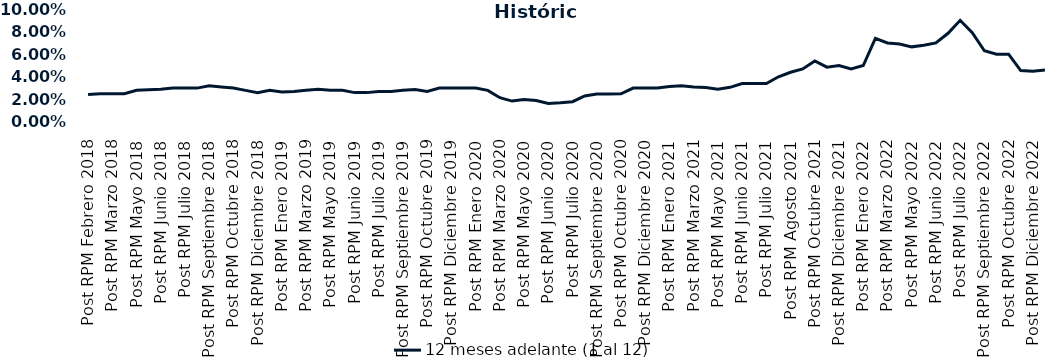
| Category | 12 meses adelante (1 al 12)  |
|---|---|
| Post RPM Febrero 2018 | 0.024 |
| Pre RPM Marzo 2018 | 0.025 |
| Post RPM Marzo 2018 | 0.025 |
| Pre RPM Mayo 2018 | 0.025 |
| Post RPM Mayo 2018 | 0.028 |
| Pre RPM Junio 2018 | 0.028 |
| Post RPM Junio 2018 | 0.029 |
| Pre RPM Julio 2018 | 0.03 |
| Post RPM Julio 2018 | 0.03 |
| Pre RPM Septiembre 2018 | 0.03 |
| Post RPM Septiembre 2018 | 0.032 |
| Pre RPM Octubre 2018 | 0.031 |
| Post RPM Octubre 2018 | 0.03 |
| Pre RPM Diciembre 2018 | 0.028 |
| Post RPM Diciembre 2018 | 0.026 |
| Pre RPM Enero 2019 | 0.028 |
| Post RPM Enero 2019 | 0.026 |
| Pre RPM Marzo 2019 | 0.027 |
| Post RPM Marzo 2019 | 0.028 |
| Pre RPM Mayo 2019 | 0.029 |
| Post RPM Mayo 2019 | 0.028 |
| Pre RPM Junio 2019 | 0.028 |
| Post RPM Junio 2019 | 0.026 |
| Pre RPM Julio 2019 | 0.026 |
| Post RPM Julio 2019 | 0.027 |
| Pre RPM Septiembre 2019 | 0.027 |
| Post RPM Septiembre 2019 | 0.028 |
| Pre RPM Octubre 2019 | 0.029 |
| Post RPM Octubre 2019 | 0.027 |
| Pre RPM Diciembre 2019 | 0.03 |
| Post RPM Diciembre 2019 | 0.03 |
| Pre RPM Enero 2020 | 0.03 |
| Post RPM Enero 2020 | 0.03 |
| Pre RPM Marzo 2020 | 0.028 |
| Post RPM Marzo 2020 | 0.022 |
| Pre RPM Mayo 2020 | 0.018 |
| Post RPM Mayo 2020 | 0.02 |
| Pre RPM Junio 2020 | 0.019 |
| Post RPM Junio 2020 | 0.016 |
| Pre RPM Julio 2020 | 0.017 |
| Post RPM Julio 2020 | 0.018 |
| Pre RPM Septiembre 2020 | 0.023 |
| Post RPM Septiembre 2020 | 0.025 |
| Pre RPM Octubre 2020 | 0.025 |
| Post RPM Octubre 2020 | 0.025 |
| Pre RPM Diciembre 2020 | 0.03 |
| Post RPM Diciembre 2020 | 0.03 |
| Pre RPM Enero 2021 | 0.03 |
| Post RPM Enero 2021 | 0.032 |
| Pre RPM Marzo 2021 | 0.032 |
| Post RPM Marzo 2021 | 0.031 |
| Pre RPM Mayo 2021 | 0.03 |
| Post RPM Mayo 2021 | 0.029 |
| Pre RPM Junio 2021 | 0.031 |
| Post RPM Junio 2021 | 0.034 |
| Pre RPM Julio 2021 | 0.034 |
| Post RPM Julio 2021 | 0.034 |
| Pre RPM Agosto 2021 | 0.04 |
| Post RPM Agosto 2021 | 0.044 |
| Pre RPM Octubre 2021 | 0.047 |
| Post RPM Octubre 2021 | 0.054 |
| Pre RPM Diciembre 2021 | 0.048 |
| Post RPM Diciembre 2021 | 0.05 |
| Pre RPM Enero 2022 | 0.047 |
| Post RPM Enero 2022 | 0.05 |
| Pre RPM Marzo 2022 | 0.074 |
| Post RPM Marzo 2022 | 0.07 |
| Pre RPM Mayo 2022 | 0.069 |
| Post RPM Mayo 2022 | 0.066 |
| Pre RPM Junio 2022 | 0.068 |
| Post RPM Junio 2022 | 0.07 |
| Pre RPM Julio 2022 | 0.078 |
| Post RPM Julio 2022 | 0.09 |
| Pre RPM Septiembre 2022 | 0.079 |
| Post RPM Septiembre 2022 | 0.063 |
| Pre RPM Octubre 2022 | 0.06 |
| Post RPM Octubre 2022 | 0.06 |
| Pre RPM Diciembre 2022 | 0.046 |
| Post RPM Diciembre 2022 | 0.045 |
| Pre RPM Enero 2023 | 0.046 |